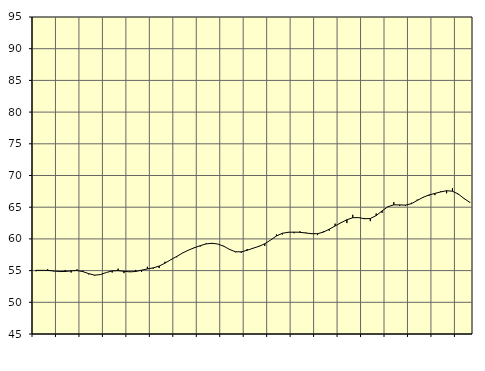
| Category | Piggar | Samtliga sysselsatta (inkl. sysselsatta utomlands) |
|---|---|---|
| nan | 54.9 | 55.04 |
| 1.0 | 55 | 55.04 |
| 1.0 | 55.2 | 55.03 |
| 1.0 | 54.9 | 54.94 |
| nan | 54.8 | 54.85 |
| 2.0 | 55.1 | 54.86 |
| 2.0 | 54.7 | 54.96 |
| 2.0 | 55.2 | 55.01 |
| nan | 55 | 54.84 |
| 3.0 | 54.4 | 54.52 |
| 3.0 | 54.2 | 54.28 |
| 3.0 | 54.4 | 54.37 |
| nan | 54.7 | 54.7 |
| 4.0 | 54.7 | 54.95 |
| 4.0 | 55.3 | 54.99 |
| 4.0 | 54.6 | 54.89 |
| nan | 54.9 | 54.8 |
| 5.0 | 55.1 | 54.86 |
| 5.0 | 54.8 | 55.07 |
| 5.0 | 55.6 | 55.26 |
| nan | 55.3 | 55.43 |
| 6.0 | 55.4 | 55.71 |
| 6.0 | 56.4 | 56.18 |
| 6.0 | 56.7 | 56.72 |
| nan | 57.1 | 57.24 |
| 7.0 | 57.8 | 57.77 |
| 7.0 | 58.2 | 58.23 |
| 7.0 | 58.7 | 58.6 |
| nan | 58.8 | 58.93 |
| 8.0 | 59.3 | 59.21 |
| 8.0 | 59.2 | 59.31 |
| 8.0 | 59.2 | 59.19 |
| nan | 58.9 | 58.85 |
| 9.0 | 58.4 | 58.34 |
| 9.0 | 57.9 | 57.97 |
| 9.0 | 57.8 | 57.96 |
| nan | 58.4 | 58.2 |
| 10.0 | 58.5 | 58.53 |
| 10.0 | 58.9 | 58.82 |
| 10.0 | 58.9 | 59.23 |
| nan | 59.8 | 59.82 |
| 11.0 | 60.7 | 60.46 |
| 11.0 | 60.7 | 60.89 |
| 11.0 | 61.1 | 61.04 |
| nan | 60.9 | 61.07 |
| 12.0 | 61.2 | 61.04 |
| 12.0 | 61 | 60.93 |
| 12.0 | 60.9 | 60.82 |
| nan | 60.6 | 60.82 |
| 13.0 | 61.2 | 61.07 |
| 13.0 | 61.3 | 61.53 |
| 13.0 | 62.4 | 62.04 |
| nan | 62.6 | 62.55 |
| 14.0 | 62.5 | 63.02 |
| 14.0 | 63.8 | 63.34 |
| 14.0 | 63.3 | 63.36 |
| nan | 63.3 | 63.18 |
| 15.0 | 62.8 | 63.22 |
| 15.0 | 64 | 63.68 |
| 15.0 | 64.1 | 64.41 |
| nan | 65.1 | 65.08 |
| 16.0 | 65.8 | 65.37 |
| 16.0 | 65.2 | 65.36 |
| 16.0 | 65.2 | 65.33 |
| nan | 65.7 | 65.55 |
| 17.0 | 66.2 | 66.07 |
| 17.0 | 66.5 | 66.56 |
| 17.0 | 66.8 | 66.93 |
| nan | 66.9 | 67.18 |
| 18.0 | 67.5 | 67.41 |
| 18.0 | 67.2 | 67.6 |
| 18.0 | 68 | 67.52 |
| nan | 67 | 67.07 |
| 19.0 | 66.3 | 66.35 |
| 19.0 | 65.7 | 65.74 |